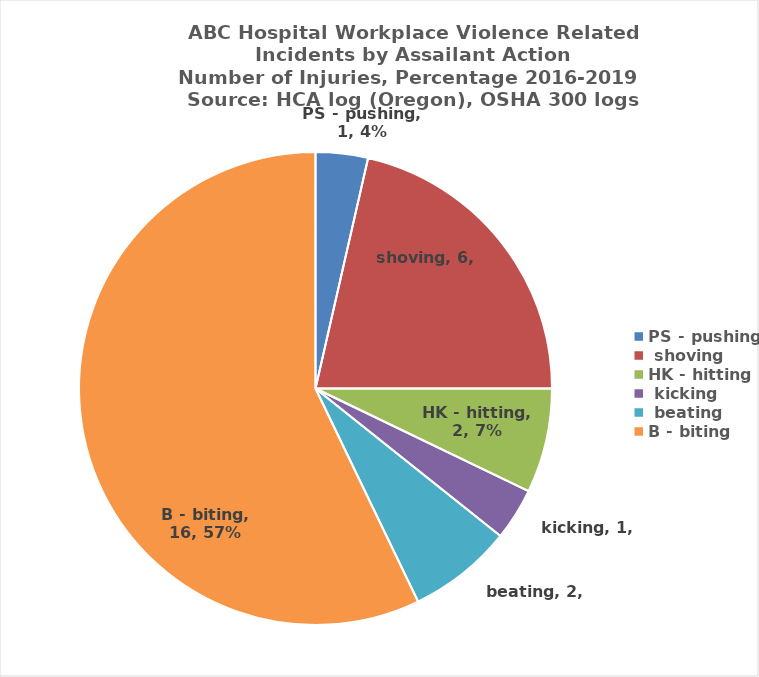
| Category | Total |
|---|---|
| PS - pushing, shoving | 1 |
| HK - hitting, kicking, beating | 6 |
| B - biting | 2 |
| TR - throwing objects | 1 |
| GR - grabbing, pinching, scratching | 2 |
| Verbal | 16 |